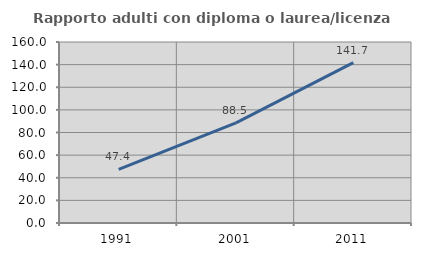
| Category | Rapporto adulti con diploma o laurea/licenza media  |
|---|---|
| 1991.0 | 47.415 |
| 2001.0 | 88.504 |
| 2011.0 | 141.713 |